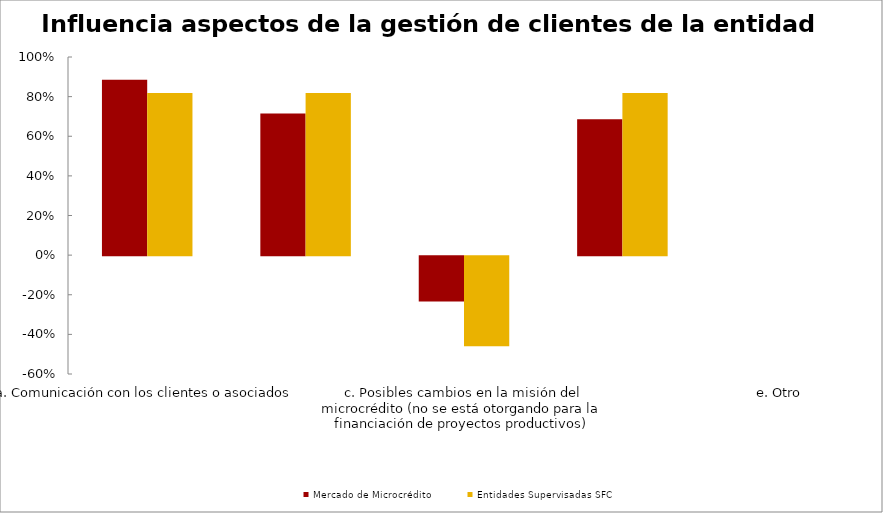
| Category | Mercado de Microcrédito | Entidades Supervisadas SFC |
|---|---|---|
| a. Comunicación con los clientes o asociados | 0.886 | 0.818 |
| b. Desarrollo de productos adecuados para los clientes o asociados | 0.714 | 0.818 |
| c. Posibles cambios en la misión del microcrédito (no se está otorgando para la financiación de proyectos productivos) | -0.229 | -0.455 |
| d. Apoyo del asesor de microcrédito | 0.686 | 0.818 |
| e. Otro | 0 | 0 |